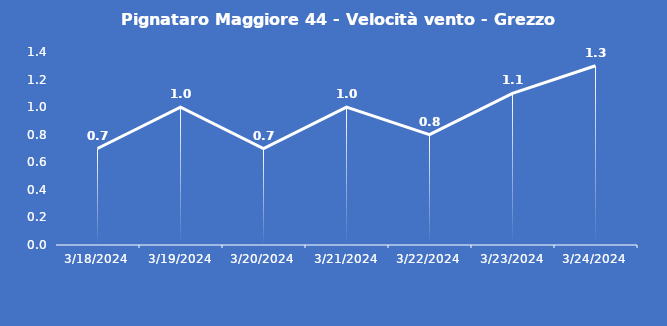
| Category | Pignataro Maggiore 44 - Velocità vento - Grezzo (m/s) |
|---|---|
| 3/18/24 | 0.7 |
| 3/19/24 | 1 |
| 3/20/24 | 0.7 |
| 3/21/24 | 1 |
| 3/22/24 | 0.8 |
| 3/23/24 | 1.1 |
| 3/24/24 | 1.3 |